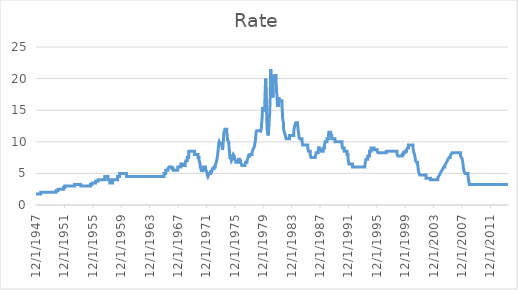
| Category | Rate |
|---|---|
| 12/1/47 | 1.75 |
| 8/1/48 | 1.75 |
| 8/1/48 | 2 |
| 9/22/50 | 2 |
| 9/22/50 | 2.25 |
| 1/8/51 | 2.25 |
| 1/8/51 | 2.5 |
| 10/17/51 | 2.5 |
| 10/17/51 | 2.75 |
| 12/19/51 | 2.75 |
| 12/19/51 | 3 |
| 4/27/53 | 3 |
| 4/27/53 | 3.25 |
| 3/17/54 | 3.25 |
| 3/17/54 | 3 |
| 8/4/55 | 3 |
| 8/4/55 | 3.25 |
| 10/14/55 | 3.25 |
| 10/14/55 | 3.5 |
| 4/13/56 | 3.5 |
| 4/13/56 | 3.75 |
| 8/21/56 | 3.75 |
| 8/21/56 | 4 |
| 8/6/57 | 4 |
| 8/6/57 | 4.5 |
| 1/22/58 | 4.5 |
| 1/22/58 | 4 |
| 4/21/58 | 4 |
| 4/21/58 | 3.5 |
| 9/11/58 | 3.5 |
| 9/11/58 | 4 |
| 5/18/59 | 4 |
| 5/18/59 | 4.5 |
| 9/1/59 | 4.5 |
| 9/1/59 | 5 |
| 8/23/60 | 5 |
| 8/23/60 | 4.5 |
| 12/6/65 | 4.5 |
| 12/6/65 | 5 |
| 3/10/66 | 5 |
| 3/10/66 | 5.5 |
| 6/29/66 | 5.5 |
| 6/29/66 | 5.75 |
| 8/16/66 | 5.75 |
| 8/16/66 | 6 |
| 1/26/67 | 6 |
| 1/26/67 | 5.75 |
| 3/27/67 | 5.75 |
| 3/27/67 | 5.5 |
| 11/20/67 | 5.5 |
| 11/20/67 | 6 |
| 4/19/68 | 6 |
| 4/19/68 | 6.5 |
| 9/25/68 | 6.5 |
| 9/25/68 | 6.25 |
| 12/2/68 | 6.25 |
| 12/2/68 | 6.5 |
| 12/18/68 | 6.5 |
| 12/18/68 | 6.75 |
| 1/7/69 | 6.75 |
| 1/7/69 | 7 |
| 3/17/69 | 7 |
| 3/17/69 | 7.5 |
| 6/9/69 | 7.5 |
| 6/9/69 | 8.5 |
| 3/25/70 | 8.5 |
| 3/25/70 | 8 |
| 9/21/70 | 8 |
| 9/21/70 | 7.5 |
| 11/12/70 | 7.5 |
| 11/12/70 | 7.25 |
| 11/23/70 | 7.25 |
| 11/23/70 | 7 |
| 12/22/70 | 7 |
| 12/22/70 | 6.75 |
| 1/6/71 | 6.75 |
| 1/6/71 | 6.5 |
| 1/15/71 | 6.5 |
| 1/15/71 | 6.25 |
| 1/18/71 | 6.25 |
| 1/18/71 | 6 |
| 2/16/71 | 6 |
| 2/16/71 | 5.75 |
| 3/11/71 | 5.75 |
| 3/11/71 | 5.5 |
| 3/19/71 | 5.5 |
| 3/19/71 | 5.25 |
| 4/23/71 | 5.25 |
| 4/23/71 | 5.5 |
| 7/7/71 | 5.5 |
| 7/7/71 | 6 |
| 10/20/71 | 6 |
| 10/20/71 | 5.75 |
| 11/8/71 | 5.75 |
| 11/8/71 | 5.5 |
| 12/17/71 | 5.5 |
| 12/17/71 | 5.25 |
| 1/3/72 | 5.25 |
| 1/3/72 | 5 |
| 1/18/72 | 5 |
| 1/18/72 | 4.75 |
| 2/16/72 | 4.75 |
| 2/16/72 | 4.5 |
| 3/20/72 | 4.5 |
| 3/20/72 | 4.75 |
| 3/31/72 | 4.75 |
| 3/31/72 | 5 |
| 6/27/72 | 5 |
| 6/27/72 | 5.25 |
| 8/29/72 | 5.25 |
| 8/29/72 | 5.5 |
| 10/3/72 | 5.5 |
| 10/3/72 | 5.75 |
| 12/27/72 | 5.75 |
| 12/27/72 | 6 |
| 2/27/73 | 6 |
| 2/27/73 | 6.25 |
| 3/26/73 | 6.25 |
| 3/26/73 | 6.5 |
| 4/19/73 | 6.5 |
| 4/19/73 | 6.75 |
| 5/7/73 | 6.75 |
| 5/7/73 | 7 |
| 5/25/73 | 7 |
| 5/25/73 | 7.25 |
| 6/7/73 | 7.25 |
| 6/7/73 | 7.5 |
| 6/22/73 | 7.5 |
| 6/22/73 | 7.75 |
| 7/2/73 | 7.75 |
| 7/2/73 | 8 |
| 7/9/73 | 8 |
| 7/9/73 | 8.25 |
| 7/18/73 | 8.25 |
| 7/18/73 | 8.5 |
| 7/30/73 | 8.5 |
| 7/30/73 | 8.75 |
| 8/6/73 | 8.75 |
| 8/6/73 | 9 |
| 8/13/73 | 9 |
| 8/13/73 | 9.25 |
| 8/21/73 | 9.25 |
| 8/21/73 | 9.5 |
| 8/28/73 | 9.5 |
| 8/28/73 | 9.75 |
| 9/18/73 | 9.75 |
| 9/18/73 | 10 |
| 10/23/73 | 10 |
| 10/23/73 | 9.75 |
| 10/29/73 | 9.75 |
| 10/29/73 | 9.5 |
| 12/3/73 | 9.5 |
| 12/3/73 | 9.75 |
| 1/29/74 | 9.75 |
| 1/29/74 | 9.5 |
| 2/11/74 | 9.5 |
| 2/11/74 | 9.25 |
| 2/19/74 | 9.25 |
| 2/19/74 | 9 |
| 2/25/74 | 9 |
| 2/25/74 | 8.75 |
| 3/22/74 | 8.75 |
| 3/22/74 | 9 |
| 4/1/74 | 9 |
| 4/1/74 | 9.25 |
| 4/4/74 | 9.25 |
| 4/4/74 | 9.5 |
| 4/8/74 | 9.5 |
| 4/8/74 | 9.75 |
| 4/11/74 | 9.75 |
| 4/11/74 | 10 |
| 4/22/74 | 10 |
| 4/22/74 | 10.25 |
| 4/25/74 | 10.25 |
| 4/25/74 | 10.5 |
| 5/2/74 | 10.5 |
| 5/2/74 | 10.75 |
| 5/7/74 | 10.75 |
| 5/7/74 | 11 |
| 5/10/74 | 11 |
| 5/10/74 | 11.25 |
| 5/17/74 | 11.25 |
| 5/17/74 | 11.5 |
| 6/27/74 | 11.5 |
| 6/27/74 | 11.75 |
| 7/8/74 | 11.75 |
| 7/8/74 | 12 |
| 10/8/74 | 12 |
| 10/8/74 | 11.75 |
| 10/22/74 | 11.75 |
| 10/22/74 | 11.25 |
| 11/6/74 | 11.25 |
| 11/6/74 | 11 |
| 11/13/74 | 11 |
| 11/13/74 | 10.75 |
| 11/25/74 | 10.75 |
| 11/25/74 | 10.25 |
| 1/9/75 | 10.25 |
| 1/9/75 | 10.25 |
| 1/15/75 | 10.25 |
| 1/15/75 | 10 |
| 1/20/75 | 10 |
| 1/20/75 | 9.75 |
| 1/28/75 | 9.75 |
| 1/28/75 | 9.5 |
| 2/3/75 | 9.5 |
| 2/3/75 | 9.25 |
| 2/10/75 | 9.25 |
| 2/10/75 | 9 |
| 2/18/75 | 9 |
| 2/18/75 | 8.75 |
| 2/24/75 | 8.75 |
| 2/24/75 | 8.5 |
| 3/5/75 | 8.5 |
| 3/5/75 | 8.25 |
| 3/10/75 | 8.25 |
| 3/10/75 | 8 |
| 3/18/75 | 8 |
| 3/18/75 | 7.75 |
| 3/24/75 | 7.75 |
| 3/24/75 | 7.5 |
| 5/20/75 | 7.5 |
| 5/20/75 | 7.25 |
| 6/9/75 | 7.25 |
| 6/9/75 | 7 |
| 7/20/75 | 7 |
| 7/20/75 | 7.25 |
| 7/29/75 | 7.25 |
| 7/29/75 | 7.5 |
| 8/11/75 | 7.5 |
| 8/11/75 | 7.75 |
| 9/12/75 | 7.75 |
| 9/12/75 | 8 |
| 10/28/75 | 8 |
| 10/28/75 | 7.75 |
| 11/7/75 | 7.75 |
| 11/7/75 | 7.5 |
| 12/2/75 | 7.5 |
| 12/2/75 | 7.25 |
| 1/12/76 | 7.25 |
| 1/12/76 | 7 |
| 1/21/76 | 7 |
| 1/21/76 | 6.75 |
| 6/1/76 | 6.75 |
| 6/1/76 | 7 |
| 6/10/76 | 7 |
| 6/10/76 | 7.25 |
| 8/3/76 | 7.25 |
| 8/3/76 | 7 |
| 9/24/76 | 7 |
| 9/24/76 | 6.75 |
| 11/1/76 | 6.75 |
| 11/1/76 | 6.5 |
| 11/24/76 | 6.5 |
| 11/24/76 | 6.25 |
| 5/13/77 | 6.25 |
| 5/13/77 | 6.5 |
| 5/31/77 | 6.5 |
| 5/31/77 | 6.75 |
| 8/22/77 | 6.75 |
| 8/22/77 | 7 |
| 9/16/77 | 7 |
| 9/16/77 | 7.25 |
| 10/7/77 | 7.25 |
| 10/7/77 | 7.5 |
| 10/24/77 | 7.5 |
| 10/24/77 | 7.75 |
| 1/10/78 | 7.75 |
| 1/10/78 | 8 |
| 5/5/78 | 8 |
| 5/5/78 | 8.25 |
| 5/26/78 | 8.25 |
| 5/26/78 | 8.5 |
| 6/16/78 | 8.5 |
| 6/16/78 | 8.75 |
| 7/30/78 | 8.75 |
| 7/30/78 | 9 |
| 8/31/78 | 9 |
| 8/31/78 | 9.25 |
| 9/15/78 | 9.25 |
| 9/15/78 | 9.5 |
| 9/28/78 | 9.5 |
| 9/28/78 | 9.75 |
| 10/13/78 | 9.75 |
| 10/13/78 | 10 |
| 10/27/78 | 10 |
| 10/27/78 | 10.25 |
| 11/1/78 | 10.25 |
| 11/1/78 | 10.5 |
| 11/6/78 | 10.5 |
| 11/6/78 | 10.75 |
| 11/17/78 | 10.75 |
| 11/17/78 | 11 |
| 11/24/78 | 11 |
| 11/24/78 | 11.5 |
| 12/26/78 | 11.5 |
| 12/26/78 | 11.75 |
| 6/19/79 | 11.75 |
| 6/19/79 | 11.5 |
| 7/27/79 | 11.5 |
| 7/27/79 | 11.75 |
| 8/16/79 | 11.75 |
| 8/16/79 | 12 |
| 8/28/79 | 12 |
| 8/28/79 | 12.25 |
| 9/7/79 | 12.25 |
| 9/7/79 | 12.75 |
| 9/14/79 | 12.75 |
| 9/14/79 | 13 |
| 9/21/79 | 13 |
| 9/21/79 | 13.25 |
| 9/28/79 | 13.25 |
| 9/28/79 | 13.5 |
| 10/9/79 | 13.5 |
| 10/9/79 | 14 |
| 10/23/79 | 14 |
| 10/23/79 | 15 |
| 11/1/79 | 15 |
| 11/1/79 | 15.25 |
| 11/9/79 | 15.25 |
| 11/9/79 | 15.5 |
| 11/16/79 | 15.5 |
| 11/16/79 | 14.75 |
| 11/30/79 | 14.75 |
| 11/30/79 | 15.5 |
| 12/7/79 | 15.5 |
| 12/7/79 | 15.25 |
| 2/19/80 | 15.25 |
| 2/19/80 | 15.75 |
| 2/22/80 | 15.75 |
| 2/22/80 | 16.5 |
| 2/29/80 | 16.5 |
| 2/29/80 | 16.75 |
| 3/4/80 | 16.75 |
| 3/4/80 | 17.25 |
| 3/7/80 | 17.25 |
| 3/7/80 | 17.75 |
| 3/14/80 | 17.75 |
| 3/14/80 | 18.5 |
| 3/19/80 | 18.5 |
| 3/19/80 | 19 |
| 3/28/80 | 19 |
| 3/28/80 | 19.5 |
| 4/2/80 | 19.5 |
| 4/2/80 | 20 |
| 4/18/80 | 20 |
| 4/18/80 | 19.5 |
| 5/1/80 | 19.5 |
| 5/1/80 | 18.5 |
| 5/7/80 | 18.5 |
| 5/7/80 | 17.5 |
| 5/16/80 | 17.5 |
| 5/16/80 | 16.5 |
| 5/23/80 | 16.5 |
| 5/23/80 | 14.5 |
| 5/30/80 | 14.5 |
| 5/30/80 | 14 |
| 6/6/80 | 14 |
| 6/6/80 | 13 |
| 6/13/80 | 13 |
| 6/13/80 | 12.5 |
| 6/17/80 | 12.5 |
| 6/17/80 | 12 |
| 7/7/80 | 12 |
| 7/7/80 | 11.5 |
| 7/25/80 | 11.5 |
| 7/25/80 | 11 |
| 8/22/80 | 11 |
| 8/22/80 | 11.25 |
| 8/27/80 | 11.25 |
| 8/27/80 | 11.5 |
| 9/8/80 | 11.5 |
| 9/8/80 | 12 |
| 9/12/80 | 12 |
| 9/12/80 | 12.25 |
| 9/19/80 | 12.25 |
| 9/19/80 | 12.5 |
| 9/26/80 | 12.5 |
| 9/26/80 | 13 |
| 10/1/80 | 13 |
| 10/1/80 | 13.5 |
| 10/17/80 | 13.5 |
| 10/17/80 | 14 |
| 10/29/80 | 14 |
| 10/29/80 | 14.5 |
| 11/6/80 | 14.5 |
| 11/6/80 | 15.5 |
| 11/17/80 | 15.5 |
| 11/17/80 | 16.25 |
| 11/21/80 | 16.25 |
| 11/21/80 | 17 |
| 11/26/80 | 17 |
| 11/26/80 | 17.75 |
| 12/2/80 | 17.75 |
| 12/2/80 | 18.5 |
| 12/5/80 | 18.5 |
| 12/5/80 | 19 |
| 12/10/80 | 19 |
| 12/10/80 | 20 |
| 12/16/80 | 20 |
| 12/16/80 | 21 |
| 12/19/80 | 21 |
| 12/19/80 | 21.5 |
| 1/2/81 | 21.5 |
| 1/2/81 | 20.5 |
| 1/9/81 | 20.5 |
| 1/9/81 | 20 |
| 2/3/81 | 20 |
| 2/3/81 | 19.5 |
| 2/23/81 | 19.5 |
| 2/23/81 | 19 |
| 3/10/81 | 19 |
| 3/10/81 | 18 |
| 3/17/81 | 18 |
| 3/17/81 | 17.5 |
| 4/2/81 | 17.5 |
| 4/2/81 | 17 |
| 4/24/81 | 17 |
| 4/24/81 | 17.5 |
| 4/30/81 | 17.5 |
| 4/30/81 | 18 |
| 5/4/81 | 18 |
| 5/4/81 | 19 |
| 5/11/81 | 19 |
| 5/11/81 | 19.5 |
| 5/19/81 | 19.5 |
| 5/19/81 | 20 |
| 5/22/81 | 20 |
| 5/22/81 | 20.5 |
| 6/3/81 | 20.5 |
| 6/3/81 | 20 |
| 7/8/81 | 20 |
| 7/8/81 | 20.5 |
| 9/15/81 | 20.5 |
| 9/15/81 | 19.5 |
| 10/5/81 | 19.5 |
| 10/5/81 | 19 |
| 10/13/81 | 19 |
| 10/13/81 | 18 |
| 11/3/81 | 18 |
| 11/3/81 | 17.5 |
| 11/9/81 | 17.5 |
| 11/9/81 | 17 |
| 11/16/81 | 17 |
| 11/16/81 | 16.5 |
| 11/24/81 | 16.5 |
| 11/24/81 | 16 |
| 12/3/81 | 16 |
| 12/3/81 | 15.75 |
| 2/8/82 | 15.75 |
| 2/8/82 | 16.5 |
| 2/18/82 | 16.5 |
| 2/18/82 | 17 |
| 2/23/82 | 17 |
| 2/23/82 | 16.5 |
| 7/20/82 | 16.5 |
| 7/20/82 | 16 |
| 7/29/82 | 16 |
| 7/29/82 | 15.5 |
| 8/2/82 | 15.5 |
| 8/2/82 | 15 |
| 8/16/82 | 15 |
| 8/16/82 | 14.5 |
| 8/18/82 | 14.5 |
| 8/18/82 | 14 |
| 9/3/82 | 14 |
| 9/3/82 | 13.5 |
| 10/7/82 | 13.5 |
| 10/7/82 | 13 |
| 10/13/82 | 13 |
| 10/13/82 | 12 |
| 11/22/82 | 12 |
| 11/22/82 | 11.5 |
| 1/11/83 | 11.5 |
| 1/11/83 | 11 |
| 2/21/83 | 11 |
| 2/21/83 | 10.5 |
| 8/8/83 | 10.5 |
| 8/8/83 | 11 |
| 3/19/84 | 11 |
| 3/19/84 | 11.5 |
| 4/5/84 | 11.5 |
| 4/5/84 | 12 |
| 5/8/84 | 12 |
| 5/8/84 | 12.5 |
| 6/26/84 | 12.5 |
| 6/26/84 | 13 |
| 9/27/84 | 13 |
| 9/27/84 | 12.75 |
| 10/16/84 | 12.75 |
| 10/16/84 | 12.5 |
| 10/24/84 | 12.5 |
| 10/24/84 | 12 |
| 11/8/84 | 12 |
| 11/8/84 | 11.75 |
| 11/28/84 | 11.75 |
| 11/28/84 | 11.25 |
| 12/19/84 | 11.25 |
| 12/19/84 | 10.75 |
| 1/15/85 | 10.75 |
| 1/15/85 | 10.5 |
| 5/20/85 | 10.5 |
| 5/20/85 | 10 |
| 6/18/85 | 10 |
| 6/18/85 | 9.5 |
| 3/7/86 | 9.5 |
| 3/7/86 | 9 |
| 4/21/86 | 9 |
| 4/21/86 | 8.5 |
| 7/11/86 | 8.5 |
| 7/11/86 | 8 |
| 8/26/86 | 8 |
| 8/26/86 | 7.5 |
| 4/1/87 | 7.5 |
| 4/1/87 | 7.75 |
| 5/1/87 | 7.75 |
| 5/1/87 | 8 |
| 5/15/87 | 8 |
| 5/15/87 | 8.25 |
| 9/4/87 | 8.25 |
| 9/4/87 | 8.75 |
| 10/7/87 | 8.75 |
| 10/7/87 | 9.25 |
| 10/22/87 | 9.25 |
| 10/22/87 | 9 |
| 11/5/87 | 9 |
| 11/5/87 | 8.75 |
| 2/2/88 | 8.75 |
| 2/2/88 | 8.5 |
| 5/11/88 | 8.5 |
| 5/11/88 | 9 |
| 7/14/88 | 9 |
| 7/14/88 | 9.5 |
| 8/11/88 | 9.5 |
| 8/11/88 | 10 |
| 11/28/88 | 10 |
| 11/28/88 | 10.5 |
| 2/10/89 | 10.5 |
| 2/10/89 | 11 |
| 2/24/89 | 11 |
| 2/24/89 | 11.5 |
| 6/5/89 | 11.5 |
| 6/5/89 | 11 |
| 7/31/89 | 11 |
| 7/31/89 | 10.5 |
| 1/8/90 | 10.5 |
| 1/8/90 | 10 |
| 1/2/91 | 10 |
| 1/2/91 | 9.5 |
| 2/4/91 | 9.5 |
| 2/4/91 | 9 |
| 5/1/91 | 9 |
| 5/1/91 | 8.5 |
| 9/13/91 | 8.5 |
| 9/13/91 | 8 |
| 11/6/91 | 8 |
| 11/6/91 | 7.5 |
| 12/23/91 | 7.5 |
| 12/23/91 | 6.5 |
| 7/2/92 | 6.5 |
| 7/2/92 | 6 |
| 3/24/94 | 6 |
| 3/24/94 | 6.25 |
| 4/19/94 | 6.25 |
| 4/19/94 | 6.75 |
| 5/18/94 | 6.75 |
| 5/18/94 | 7.25 |
| 8/16/94 | 7.25 |
| 8/16/94 | 7.75 |
| 11/15/94 | 7.75 |
| 11/15/94 | 8.5 |
| 2/1/95 | 8.5 |
| 2/1/95 | 9 |
| 7/7/95 | 9 |
| 7/7/95 | 8.75 |
| 12/20/95 | 8.75 |
| 12/20/95 | 8.5 |
| 1/31/96 | 8.5 |
| 1/31/96 | 8.25 |
| 3/27/97 | 8.25 |
| 3/27/97 | 8.5 |
| 9/30/98 | 8.5 |
| 9/30/98 | 8.25 |
| 10/16/98 | 8.25 |
| 10/16/98 | 8 |
| 11/18/98 | 8 |
| 11/18/98 | 7.75 |
| 7/1/99 | 7.75 |
| 7/1/99 | 8 |
| 8/25/99 | 8 |
| 8/25/99 | 8.25 |
| 11/17/99 | 8.25 |
| 11/17/99 | 8.5 |
| 2/3/00 | 8.5 |
| 2/3/00 | 8.75 |
| 3/22/00 | 8.75 |
| 3/22/00 | 9 |
| 5/17/00 | 9 |
| 5/17/00 | 9.5 |
| 1/4/01 | 9.5 |
| 1/4/01 | 9 |
| 2/1/01 | 9 |
| 2/1/01 | 8.5 |
| 3/21/01 | 8.5 |
| 3/21/01 | 8 |
| 4/19/01 | 8 |
| 4/19/01 | 7.5 |
| 5/16/01 | 7.5 |
| 5/16/01 | 7 |
| 6/28/01 | 7 |
| 6/28/01 | 6.75 |
| 8/22/01 | 6.75 |
| 8/22/01 | 6.5 |
| 9/18/01 | 6.5 |
| 9/18/01 | 6 |
| 10/3/01 | 6 |
| 10/3/01 | 5.5 |
| 11/7/01 | 5.5 |
| 11/7/01 | 5 |
| 12/12/01 | 5 |
| 12/12/01 | 4.75 |
| 11/7/02 | 4.75 |
| 11/7/02 | 4.25 |
| 6/27/03 | 4.25 |
| 6/27/03 | 4 |
| 7/1/04 | 4 |
| 7/1/04 | 4.25 |
| 8/11/04 | 4.25 |
| 8/11/04 | 4.5 |
| 9/21/04 | 4.5 |
| 9/21/04 | 4.75 |
| 11/10/04 | 4.75 |
| 11/10/04 | 5 |
| 12/14/04 | 5 |
| 12/14/04 | 5.25 |
| 2/2/05 | 5.25 |
| 2/2/05 | 5.5 |
| 3/22/05 | 5.5 |
| 3/22/05 | 5.75 |
| 5/3/05 | 5.75 |
| 5/3/05 | 6 |
| 6/30/05 | 6 |
| 6/30/05 | 6.25 |
| 8/9/05 | 6.25 |
| 8/9/05 | 6.5 |
| 9/20/05 | 6.5 |
| 9/20/05 | 6.75 |
| 11/1/05 | 6.75 |
| 11/1/05 | 7 |
| 12/13/05 | 7 |
| 12/13/05 | 7.25 |
| 1/31/06 | 7.25 |
| 1/31/06 | 7.5 |
| 3/28/06 | 7.5 |
| 3/28/06 | 7.75 |
| 5/10/06 | 7.75 |
| 5/10/06 | 8 |
| 6/29/06 | 8 |
| 6/29/06 | 8.25 |
| 9/18/07 | 8.25 |
| 9/18/07 | 7.75 |
| 10/31/07 | 7.75 |
| 10/31/07 | 7.5 |
| 12/11/07 | 7.5 |
| 12/11/07 | 7.25 |
| 1/22/08 | 7.25 |
| 1/22/08 | 6.5 |
| 1/30/08 | 6.5 |
| 1/30/08 | 6 |
| 3/18/08 | 6 |
| 3/18/08 | 5.25 |
| 4/30/08 | 5.25 |
| 4/30/08 | 5 |
| 10/8/08 | 5 |
| 10/8/08 | 4.5 |
| 10/29/08 | 4.5 |
| 10/29/08 | 4 |
| 12/16/08 | 4 |
| 12/16/08 | 3.25 |
| 5/21/14 | 3.25 |
| 5/21/14 | 3.25 |